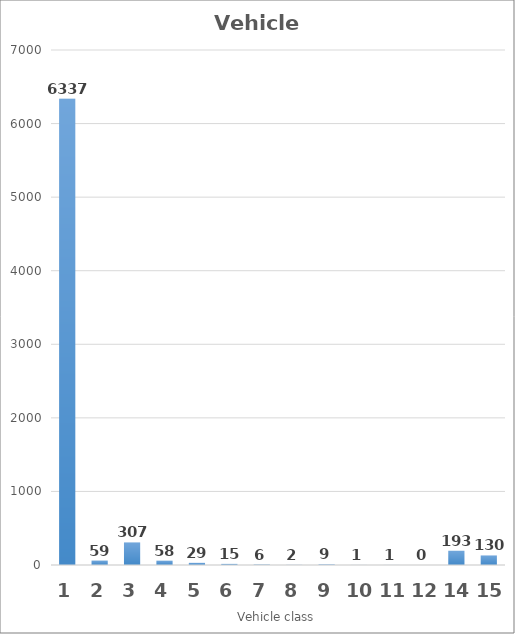
| Category | Series 0 |
|---|---|
| 1.0 | 6337 |
| 2.0 | 59 |
| 3.0 | 307 |
| 4.0 | 58 |
| 5.0 | 29 |
| 6.0 | 15 |
| 7.0 | 6 |
| 8.0 | 2 |
| 9.0 | 9 |
| 10.0 | 1 |
| 11.0 | 1 |
| 12.0 | 0 |
| 14.0 | 193 |
| 15.0 | 130 |